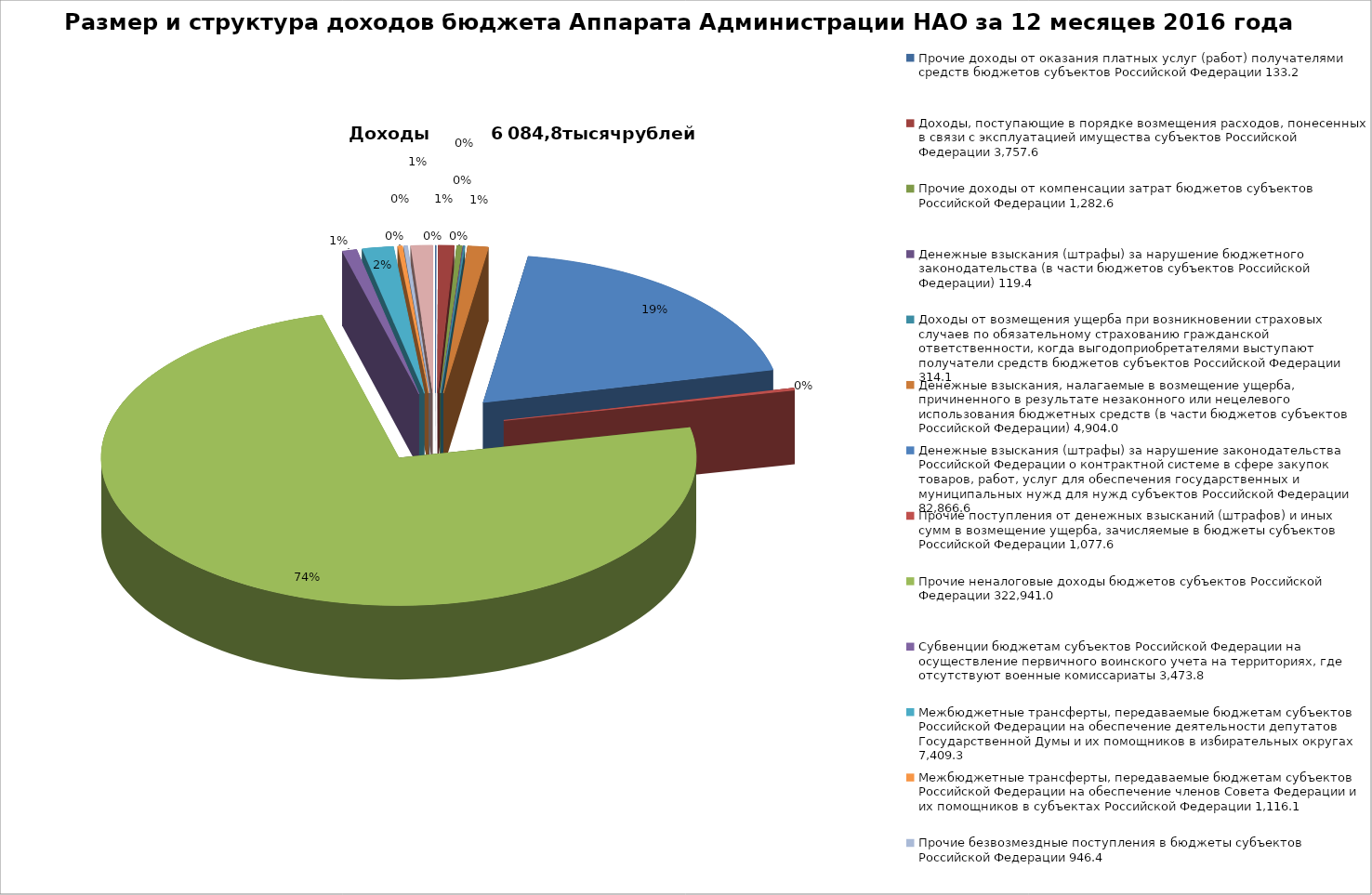
| Category | Размер и структура доходов бюджета Аппарата Администрации НАО за 12 месяцев |
|---|---|
| 0 | 133.2 |
| 1 | 3757.6 |
| 2 | 1282.6 |
| 3 | 119.4 |
| 4 | 314.1 |
| 5 | 4904 |
| 6 | 82866.6 |
| 7 | 1077.6 |
| 8 | 322941 |
| 9 | 3473.8 |
| 10 | 7409.3 |
| 11 | 1116.1 |
| 12 | 946.4 |
| 13 | 5177.5 |